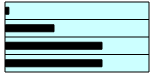
| Category | Series 0 |
|---|---|
| 0 | 0.02 |
| 1 | 0.333 |
| 2 | 0.667 |
| 3 | 0.667 |